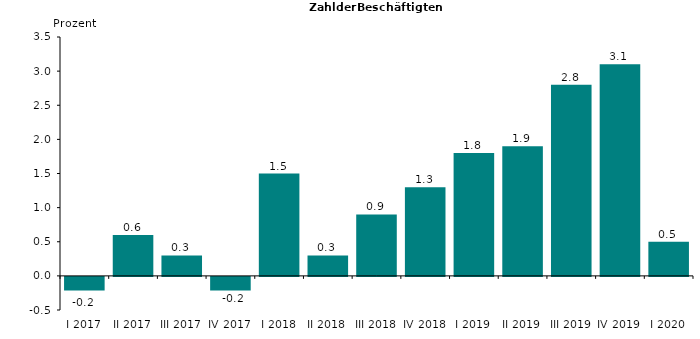
| Category | -0,2 |
|---|---|
| I 2017 | -0.2 |
| II 2017 | 0.6 |
| III 2017 | 0.3 |
| IV 2017 | -0.2 |
| I 2018 | 1.5 |
| II 2018 | 0.3 |
| III 2018 | 0.9 |
| IV 2018 | 1.3 |
| I 2019 | 1.8 |
| II 2019 | 1.9 |
| III 2019 | 2.8 |
| IV 2019 | 3.1 |
| I 2020 | 0.5 |